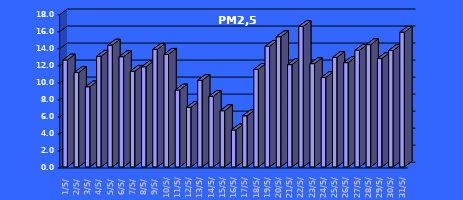
| Category | PM2,5 [µg/m3] |
|---|---|
| 2023-05-01 | 12.566 |
| 2023-05-02 | 11.085 |
| 2023-05-03 | 9.416 |
| 2023-05-04 | 13.008 |
| 2023-05-05 | 14.317 |
| 2023-05-06 | 12.949 |
| 2023-05-07 | 11.239 |
| 2023-05-08 | 11.765 |
| 2023-05-09 | 13.804 |
| 2023-05-10 | 13.232 |
| 2023-05-11 | 9.042 |
| 2023-05-12 | 7.003 |
| 2023-05-13 | 10.169 |
| 2023-05-14 | 8.291 |
| 2023-05-15 | 6.604 |
| 2023-05-16 | 4.345 |
| 2023-05-17 | 6.005 |
| 2023-05-18 | 11.466 |
| 2023-05-19 | 14.169 |
| 2023-05-20 | 15.294 |
| 2023-05-21 | 12.019 |
| 2023-05-22 | 16.509 |
| 2023-05-23 | 12.137 |
| 2023-05-24 | 10.504 |
| 2023-05-25 | 12.863 |
| 2023-05-26 | 12.255 |
| 2023-05-27 | 13.697 |
| 2023-05-28 | 14.369 |
| 2023-05-29 | 12.736 |
| 2023-05-30 | 13.679 |
| 2023-05-31 | 15.829 |